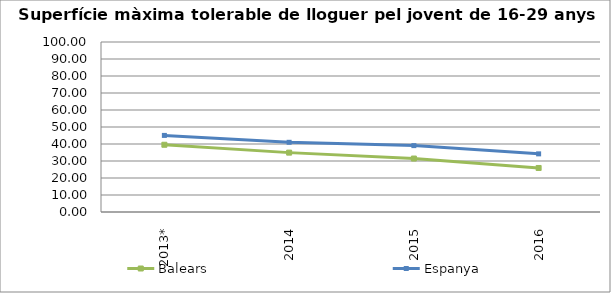
| Category | Balears | Espanya |
|---|---|---|
| 2013* | 39.55 | 45.05 |
| 2014 | 34.925 | 41 |
| 2015 | 31.45 | 39.05 |
| 2016 | 25.9 | 34.2 |